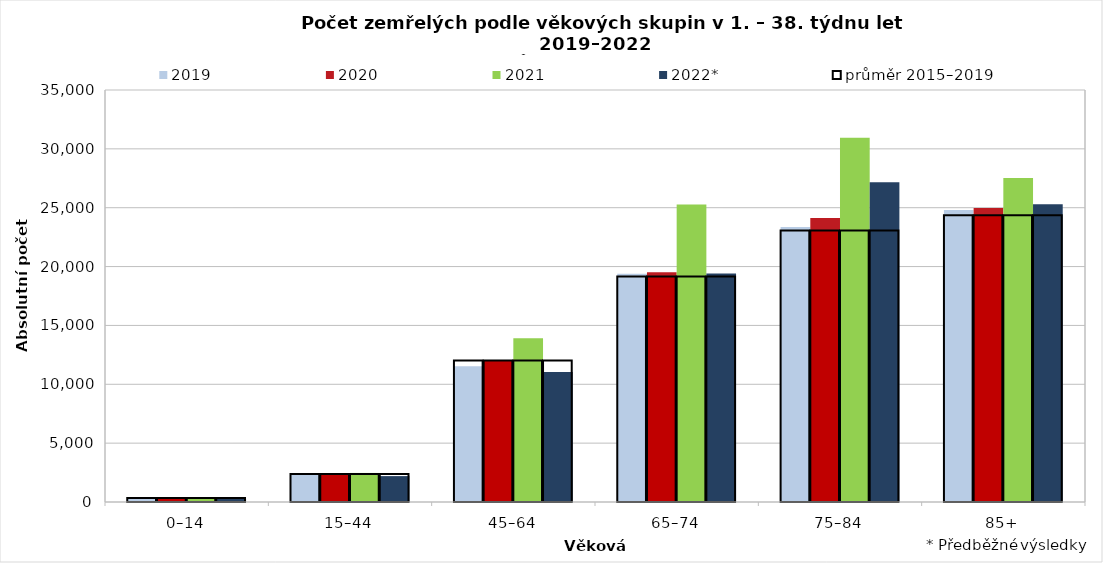
| Category | 2019 | 2020 | 2021 | 2022* |
|---|---|---|---|---|
| 0–14 | 352 | 300 | 287 | 290 |
| 15–44 | 2343 | 2251 | 2469 | 2200 |
| 45–64 | 11528 | 11245 | 13913 | 11040 |
| 65–74 | 19388 | 19523 | 25269 | 19413 |
| 75–84 | 23368 | 24135 | 30947 | 27161 |
| 85+ | 24805 | 24978 | 27529 | 25290 |